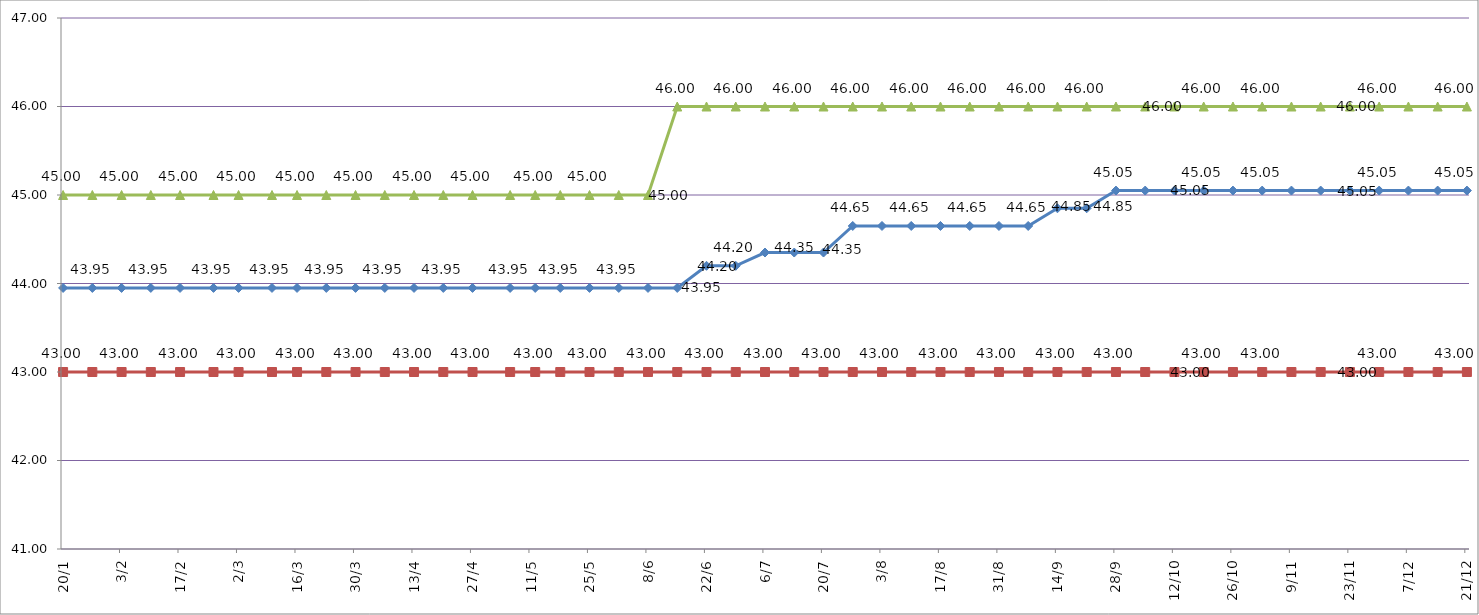
| Category | Кривошеино | Володино | Красный Яр |
|---|---|---|---|
| 2020-01-20 | 43.95 | 43 | 45 |
| 2020-01-27 | 43.95 | 43 | 45 |
| 2020-02-03 | 43.95 | 43 | 45 |
| 2020-02-10 | 43.95 | 43 | 45 |
| 2020-02-17 | 43.95 | 43 | 45 |
| 2020-02-25 | 43.95 | 43 | 45 |
| 2020-03-02 | 43.95 | 43 | 45 |
| 2020-03-10 | 43.95 | 43 | 45 |
| 2020-03-16 | 43.95 | 43 | 45 |
| 2020-03-23 | 43.95 | 43 | 45 |
| 2020-03-30 | 43.95 | 43 | 45 |
| 2020-04-06 | 43.95 | 43 | 45 |
| 2020-04-13 | 43.95 | 43 | 45 |
| 2020-04-20 | 43.95 | 43 | 45 |
| 2020-04-27 | 43.95 | 43 | 45 |
| 2020-05-06 | 43.95 | 43 | 45 |
| 2020-05-12 | 43.95 | 43 | 45 |
| 2020-05-18 | 43.95 | 43 | 45 |
| 2020-05-25 | 43.95 | 43 | 45 |
| 2020-06-01 | 43.95 | 43 | 45 |
| 2020-06-08 | 43.95 | 43 | 45 |
| 2020-06-15 | 43.95 | 43 | 46 |
| 2020-06-22 | 44.2 | 43 | 46 |
| 2020-06-29 | 44.2 | 43 | 46 |
| 2020-07-06 | 44.35 | 43 | 46 |
| 2020-07-13 | 44.35 | 43 | 46 |
| 2020-07-20 | 44.35 | 43 | 46 |
| 2020-07-27 | 44.65 | 43 | 46 |
| 2020-08-03 | 44.65 | 43 | 46 |
| 2020-08-10 | 44.65 | 43 | 46 |
| 2020-08-17 | 44.65 | 43 | 46 |
| 2020-08-24 | 44.65 | 43 | 46 |
| 2020-08-31 | 44.65 | 43 | 46 |
| 2020-09-07 | 44.65 | 43 | 46 |
| 2020-09-14 | 44.85 | 43 | 46 |
| 2020-09-21 | 44.85 | 43 | 46 |
| 2020-09-28 | 45.05 | 43 | 46 |
| 2020-10-05 | 45.05 | 43 | 46 |
| 2020-10-12 | 45.05 | 43 | 46 |
| 2020-10-19 | 45.05 | 43 | 46 |
| 2020-10-26 | 45.05 | 43 | 46 |
| 2020-11-02 | 45.05 | 43 | 46 |
| 2020-11-09 | 45.05 | 43 | 46 |
| 2020-11-16 | 45.05 | 43 | 46 |
| 2020-11-23 | 45.05 | 43 | 46 |
| 2020-11-30 | 45.05 | 43 | 46 |
| 2020-12-07 | 45.05 | 43 | 46 |
| 2020-12-14 | 45.05 | 43 | 46 |
| 2020-12-21 | 45.05 | 43 | 46 |